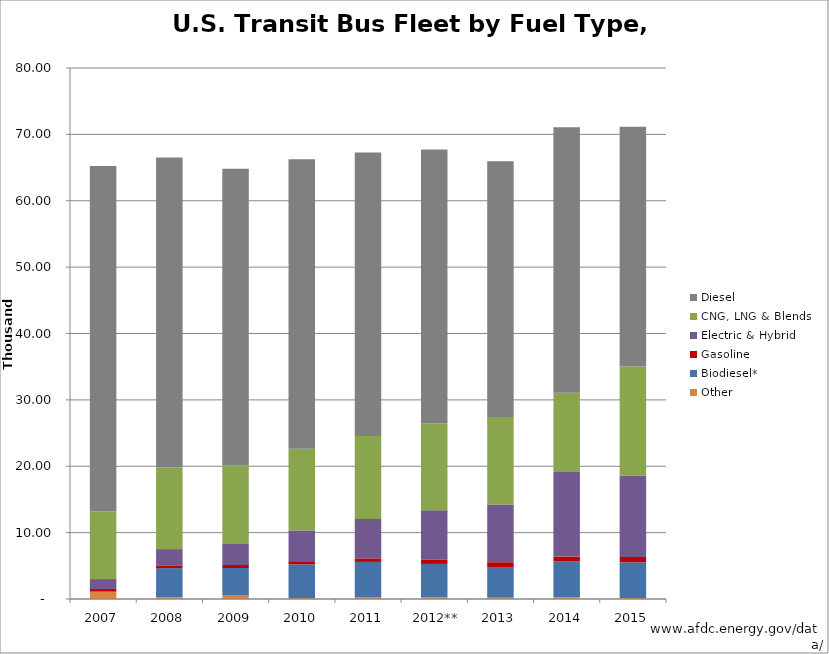
| Category | Other | Biodiesel* | Gasoline | Electric & Hybrid | CNG, LNG & Blends | Diesel |
|---|---|---|---|---|---|---|
| 2007 | 1109.233 | 0 | 391.494 | 1500.727 | 10178.844 | 52068.702 |
| 2008 | 266.024 | 4389.396 | 332.53 | 2527.228 | 12303.61 | 46687.212 |
| 2009 | 518.656 | 4149.248 | 453.824 | 3176.768 | 11864.256 | 44669.248 |
| 2010 | 132.478 | 5100.403 | 463.673 | 4636.73 | 12320.454 | 43585.262 |
| 2011 | 269.152 | 5315.752 | 538.304 | 5921.344 | 12515.568 | 42727.88 |
|   2012** | 237.024 | 5045.215 | 643.35 | 7449.31 | 13070.153 | 41275.95 |
| 2013 | 197.85 | 4616.5 | 725.45 | 8705.4 | 13190 | 38514.8 |
| 2014 | 213 | 5472 | 711 | 12721 | 11939 | 40010 |
| 2015 | 142 | 5401 | 781 | 12294 | 16416 | 36102 |